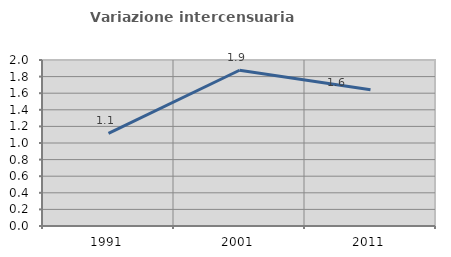
| Category | Variazione intercensuaria annua |
|---|---|
| 1991.0 | 1.116 |
| 2001.0 | 1.877 |
| 2011.0 | 1.642 |